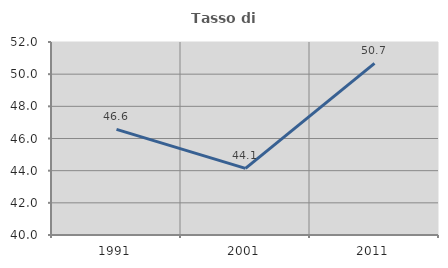
| Category | Tasso di occupazione   |
|---|---|
| 1991.0 | 46.569 |
| 2001.0 | 44.144 |
| 2011.0 | 50.667 |